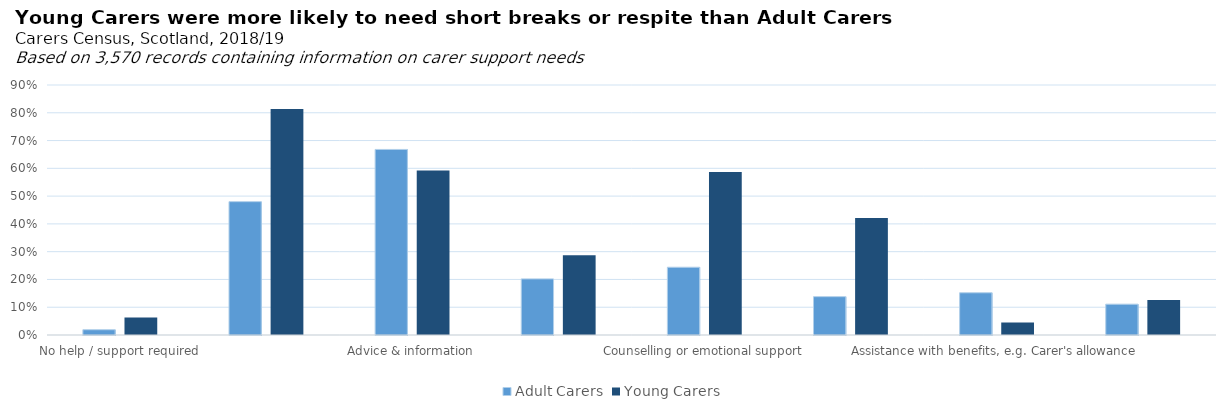
| Category | Adult Carers | Young Carers |
|---|---|---|
| No help / support required | 0.019 | 0.063 |
| Short breaks or respite | 0.48 | 0.814 |
| Advice & information | 0.668 | 0.592 |
| Practical support (e.g. transport, equipment, adaptions) | 0.202 | 0.287 |
| Counselling or emotional support | 0.244 | 0.587 |
| Training and learning | 0.138 | 0.421 |
| Assistance with benefits, e.g. Carer's allowance | 0.152 | 0.045 |
| Other support | 0.111 | 0.126 |